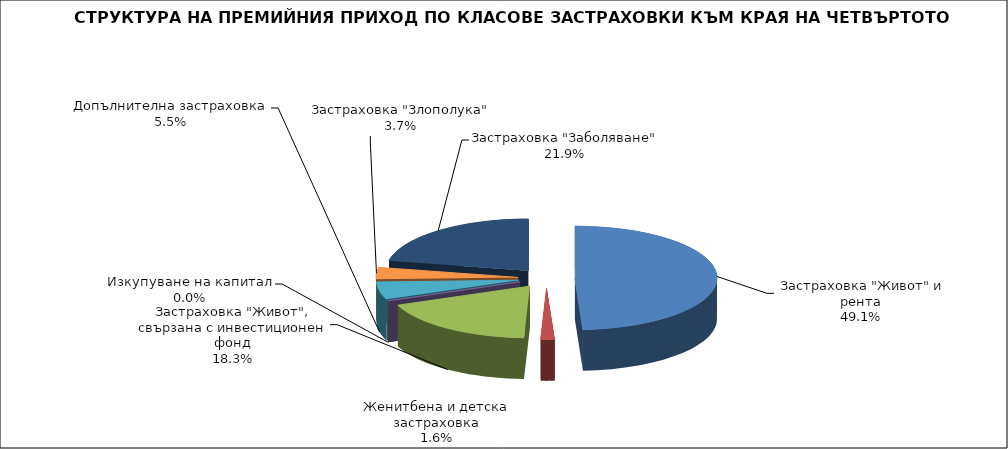
| Category |  Застраховка "Живот" и рента |
|---|---|
|  Застраховка "Живот" и рента | 244934940.058 |
| Женитбена и детска застраховка | 7887508.884 |
| Застраховка "Живот", свързана с инвестиционен фонд | 91339906.707 |
| Изкупуване на капитал | 0 |
| Допълнителна застраховка | 27257432.962 |
| Застраховка "Злополука" | 18273460.323 |
| Застраховка "Заболяване" | 109231984.726 |